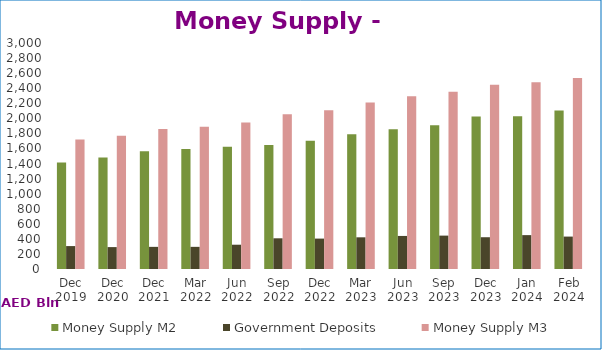
| Category | Money Supply M2 | Government Deposits | Money Supply M3 |
|---|---|---|---|
| Dec 2019 | 1413166 | 304290 | 1717456 |
| Dec 2020 | 1478607 | 290761 | 1769368 |
| Dec 2021 | 1563025 | 293885 | 1856910 |
| Mar 2022 | 1593354 | 294028 | 1887382 |
| Jun 2022 | 1622144 | 322367 | 1944511 |
| Sep 2022 | 1645538 | 407562 | 2053100 |
| Dec 2022 | 1703625 | 403604 | 2107229 |
| Mar 2023 | 1788372 | 420631 | 2209003 |
| Jun 2023 | 1855306 | 438852 | 2294158 |
| Sep 2023 | 1908088 | 443223 | 2351311 |
| Dec 2023 | 2023406 | 421760 | 2445166 |
| Jan 2024 | 2028276 | 449686 | 2477962 |
| Feb 2024 | 2104744 | 430311 | 2535055 |